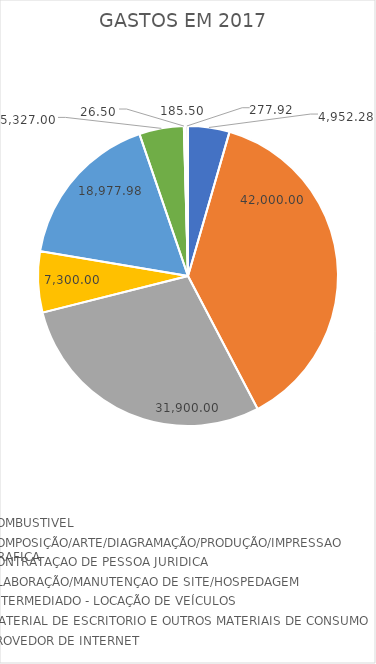
| Category | Series 0 |
|---|---|
| COMBUSTIVEL | 4952.28 |
| COMPOSIÇÃO/ARTE/DIAGRAMAÇÃO/PRODUÇÃO/IMPRESSAO GRAFICA | 42000 |
| CONTRATAÇAO DE PESSOA JURIDICA | 31900 |
| ELABORAÇÃO/MANUTENÇAO DE SITE/HOSPEDAGEM | 7300 |
| INTERMEDIADO - LOCAÇÃO DE VEÍCULOS | 18977.98 |
| MATERIAL DE ESCRITORIO E OUTROS MATERIAIS DE CONSUMO | 5327 |
| PROVEDOR DE INTERNET | 26.5 |
| REPROGRAFIA (XEROX/ENCADERNAÇÃO) | 185.5 |
| TELEFONE FIXO | 277.92 |